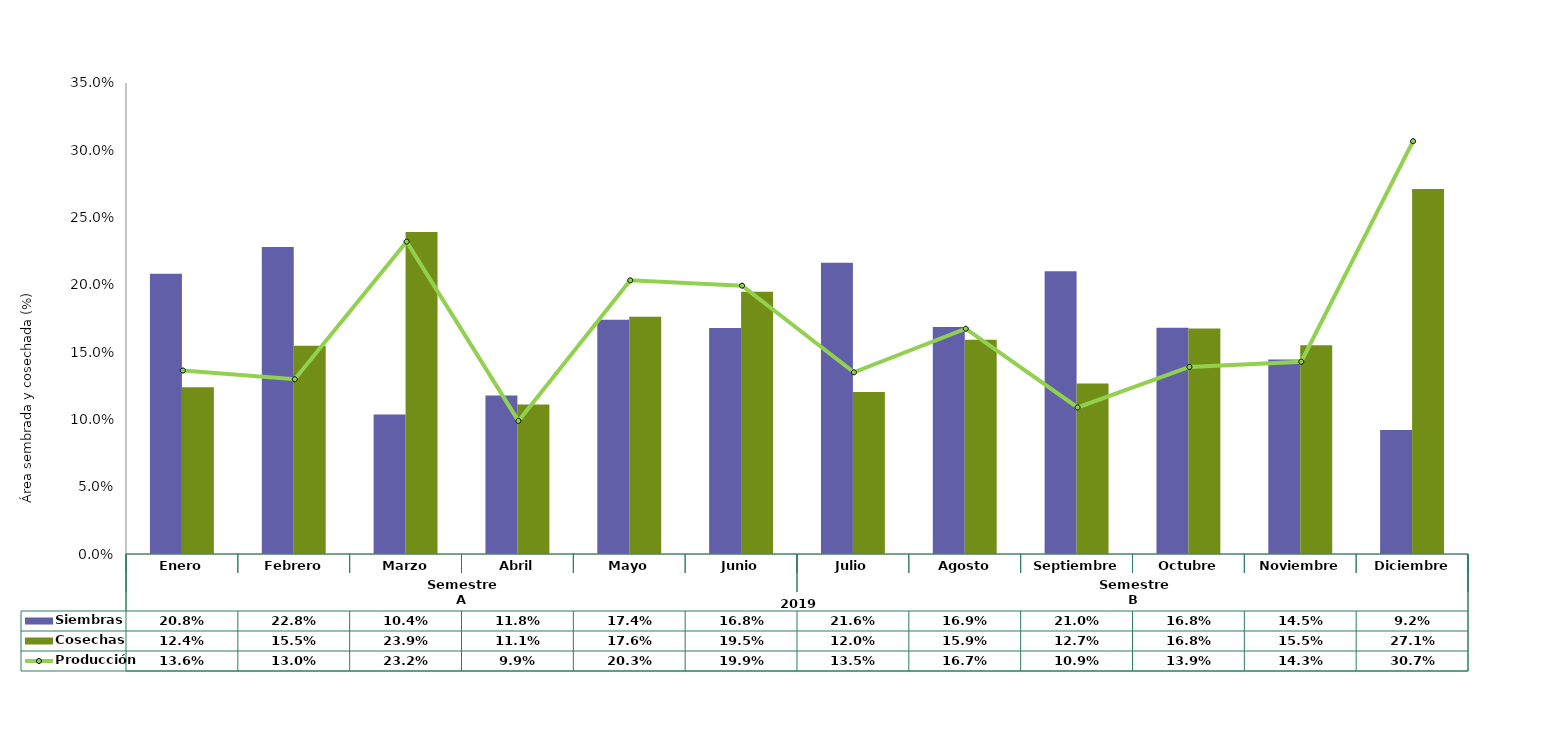
| Category | Siembras | Cosechas   |
|---|---|---|
| 0 | 0.208 | 0.124 |
| 1 | 0.228 | 0.155 |
| 2 | 0.104 | 0.239 |
| 3 | 0.118 | 0.111 |
| 4 | 0.174 | 0.176 |
| 5 | 0.168 | 0.195 |
| 6 | 0.216 | 0.12 |
| 7 | 0.169 | 0.159 |
| 8 | 0.21 | 0.127 |
| 9 | 0.168 | 0.168 |
| 10 | 0.145 | 0.155 |
| 11 | 0.092 | 0.271 |